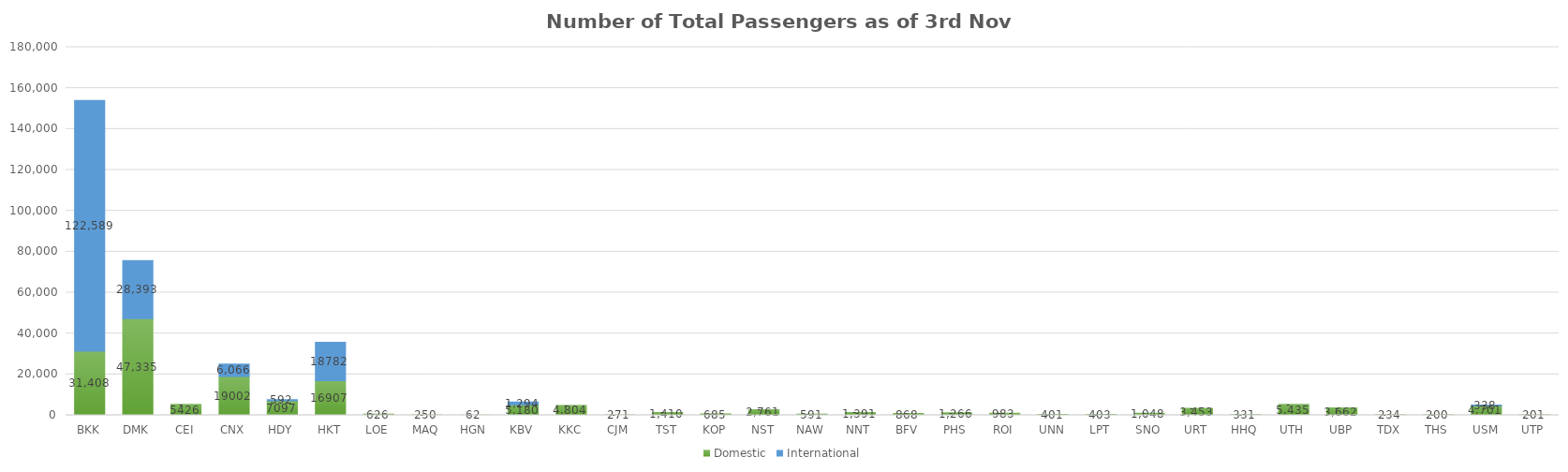
| Category | Domestic | International |
|---|---|---|
| BKK | 31408 | 122589 |
| DMK | 47335 | 28393 |
| CEI | 5426 | 0 |
| CNX | 19002 | 6066 |
| HDY | 7097 | 592 |
| HKT | 16907 | 18782 |
| LOE | 626 | 0 |
| MAQ | 250 | 0 |
| HGN | 62 | 0 |
| KBV | 5180 | 1294 |
| KKC | 4804 | 0 |
| CJM | 271 | 0 |
| TST | 1410 | 0 |
| KOP | 685 | 0 |
| NST | 2761 | 0 |
| NAW | 591 | 0 |
| NNT | 1391 | 0 |
| BFV | 868 | 0 |
| PHS | 1266 | 0 |
| ROI | 983 | 0 |
| UNN | 401 | 0 |
| LPT | 403 | 0 |
| SNO | 1048 | 0 |
| URT | 3453 | 0 |
| HHQ | 331 | 0 |
| UTH | 5435 | 0 |
| UBP | 3662 | 0 |
| TDX | 234 | 0 |
| THS | 200 | 0 |
| USM | 4701 | 338 |
| UTP | 201 | 0 |